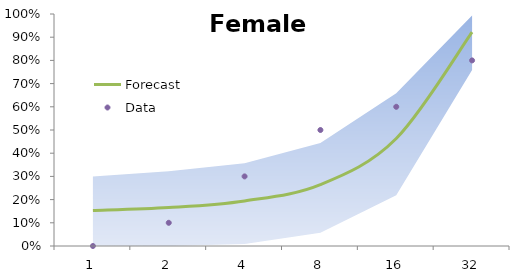
| Category | Forecast | Data |
|---|---|---|
| 0 | 0.153 | 0 |
| 1 | 0.166 | 0.1 |
| 2 | 0.194 | 0.3 |
| 3 | 0.265 | 0.5 |
| 4 | 0.463 | 0.6 |
| 5 | 0.922 | 0.8 |